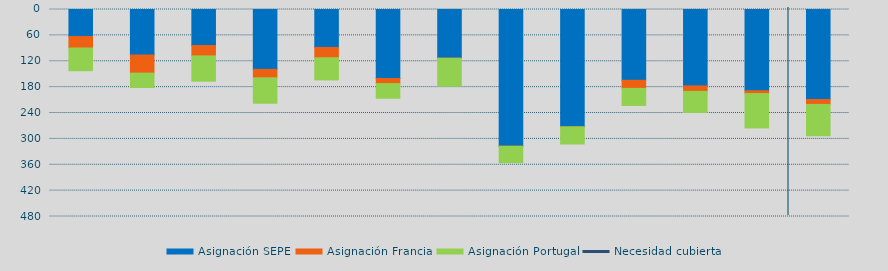
| Category | Asignación SEPE | Asignación Francia | Asignación Portugal |
|---|---|---|---|
| 0 | 62612.7 | 26635.4 | 52718.7 |
| 1 | 105519.2 | 42049.8 | 33318.5 |
| 2 | 83466.2 | 24132.5 | 58650.9 |
| 3 | 138850.6 | 19527.1 | 58931.4 |
| 4 | 88000.9 | 23926.8 | 51284.5 |
| 5 | 159946.5 | 11873.6 | 33973.4 |
| 6 | 112774.35 | 263.2 | 64888 |
| 7 | 316845.45 | 348.4 | 37996.4 |
| 8 | 271981.65 | 130 | 39763.3 |
| 9 | 164113.775 | 18818.7 | 39543.6 |
| 10 | 177218.25 | 12730.4 | 48945.8 |
| 11 | 188386.325 | 6515.6 | 79746.7 |
| 12 | 208745.675 | 11423.2 | 72605.3 |